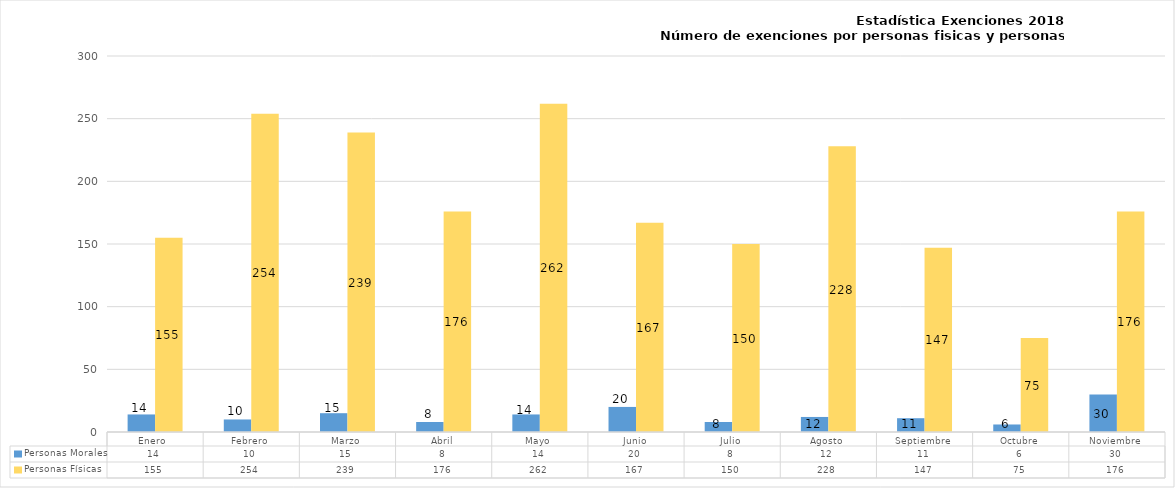
| Category | Personas Morales | Personas Físicas |
|---|---|---|
| Enero  | 14 | 155 |
| Febrero | 10 | 254 |
| Marzo | 15 | 239 |
| Abril | 8 | 176 |
| Mayo | 14 | 262 |
| Junio | 20 | 167 |
| Julio | 8 | 150 |
| Agosto | 12 | 228 |
| Septiembre | 11 | 147 |
| Octubre | 6 | 75 |
| Noviembre | 30 | 176 |